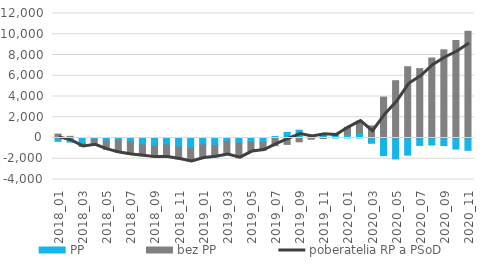
| Category | PP | bez PP |
|---|---|---|
| 2018_01 | -322 | 378 |
| 2018_02 | -392 | 159 |
| 2018_03 | -532 | -289 |
| 2018_04 | -119 | -531 |
| 2018_05 | -287 | -805 |
| 2018_06 | -227 | -1163 |
| 2018_07 | -386 | -1201 |
| 2018_08 | -658 | -1052 |
| 2018_09 | -782 | -1061 |
| 2018_10 | -668 | -1173 |
| 2018_11 | -866 | -1153 |
| 2018_12 | -991 | -1273 |
| 2019_01 | -655 | -1269 |
| 2019_02 | -706 | -1100 |
| 2019_03 | -314 | -1286 |
| 2019_04 | -495 | -1401 |
| 2019_05 | -394 | -913 |
| 2019_06 | -445 | -718 |
| 2019_07 | 150 | -746 |
| 2019_08 | 545 | -619 |
| 2019_09 | 750 | -368 |
| 2019_10 | 273 | -119 |
| 2019_11 | 401 | -49 |
| 2019_12 | 240 | 61 |
| 2020_01 | 323 | 709 |
| 2020_02 | 506 | 1126 |
| 2020_03 | -506 | 1161 |
| 2020_04 | -1694 | 3945 |
| 2020_05 | -2016 | 5523 |
| 2020_06 | -1651 | 6871 |
| 2020_07 | -715 | 6689 |
| 2020_08 | -678 | 7713 |
| 2020_09 | -732 | 8497 |
| 2020_10 | -1067 | 9400 |
| 2020_11 | -1187 | 10289 |